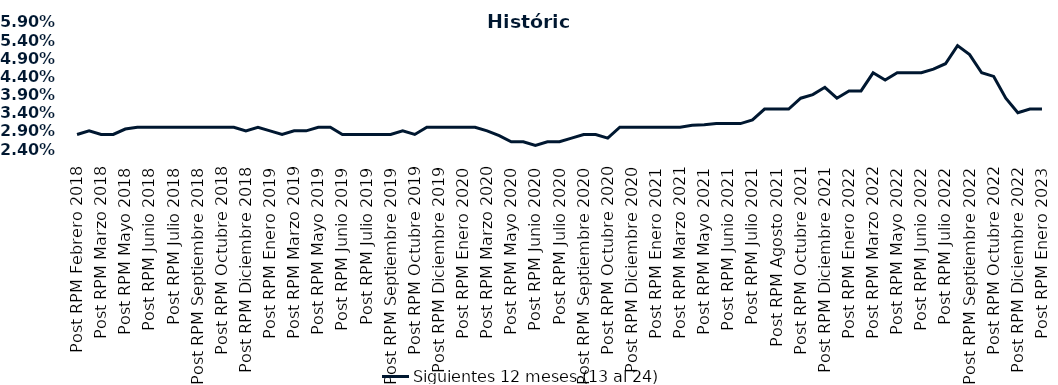
| Category | Siguientes 12 meses (13 al 24)  |
|---|---|
| Post RPM Febrero 2018 | 0.028 |
| Pre RPM Marzo 2018 | 0.029 |
| Post RPM Marzo 2018 | 0.028 |
| Pre RPM Mayo 2018 | 0.028 |
| Post RPM Mayo 2018 | 0.03 |
| Pre RPM Junio 2018 | 0.03 |
| Post RPM Junio 2018 | 0.03 |
| Pre RPM Julio 2018 | 0.03 |
| Post RPM Julio 2018 | 0.03 |
| Pre RPM Septiembre 2018 | 0.03 |
| Post RPM Septiembre 2018 | 0.03 |
| Pre RPM Octubre 2018 | 0.03 |
| Post RPM Octubre 2018 | 0.03 |
| Pre RPM Diciembre 2018 | 0.03 |
| Post RPM Diciembre 2018 | 0.029 |
| Pre RPM Enero 2019 | 0.03 |
| Post RPM Enero 2019 | 0.029 |
| Pre RPM Marzo 2019 | 0.028 |
| Post RPM Marzo 2019 | 0.029 |
| Pre RPM Mayo 2019 | 0.029 |
| Post RPM Mayo 2019 | 0.03 |
| Pre RPM Junio 2019 | 0.03 |
| Post RPM Junio 2019 | 0.028 |
| Pre RPM Julio 2019 | 0.028 |
| Post RPM Julio 2019 | 0.028 |
| Pre RPM Septiembre 2019 | 0.028 |
| Post RPM Septiembre 2019 | 0.028 |
| Pre RPM Octubre 2019 | 0.029 |
| Post RPM Octubre 2019 | 0.028 |
| Pre RPM Diciembre 2019 | 0.03 |
| Post RPM Diciembre 2019 | 0.03 |
| Pre RPM Enero 2020 | 0.03 |
| Post RPM Enero 2020 | 0.03 |
| Pre RPM Marzo 2020 | 0.03 |
| Post RPM Marzo 2020 | 0.029 |
| Pre RPM Mayo 2020 | 0.028 |
| Post RPM Mayo 2020 | 0.026 |
| Pre RPM Junio 2020 | 0.026 |
| Post RPM Junio 2020 | 0.025 |
| Pre RPM Julio 2020 | 0.026 |
| Post RPM Julio 2020 | 0.026 |
| Pre RPM Septiembre 2020 | 0.027 |
| Post RPM Septiembre 2020 | 0.028 |
| Pre RPM Octubre 2020 | 0.028 |
| Post RPM Octubre 2020 | 0.027 |
| Pre RPM Diciembre 2020 | 0.03 |
| Post RPM Diciembre 2020 | 0.03 |
| Pre RPM Enero 2021 | 0.03 |
| Post RPM Enero 2021 | 0.03 |
| Pre RPM Marzo 2021 | 0.03 |
| Post RPM Marzo 2021 | 0.03 |
| Pre RPM Mayo 2021 | 0.031 |
| Post RPM Mayo 2021 | 0.031 |
| Pre RPM Junio 2021 | 0.031 |
| Post RPM Junio 2021 | 0.031 |
| Pre RPM Julio 2021 | 0.031 |
| Post RPM Julio 2021 | 0.032 |
| Pre RPM Agosto 2021 | 0.035 |
| Post RPM Agosto 2021 | 0.035 |
| Pre RPM Octubre 2021 | 0.035 |
| Post RPM Octubre 2021 | 0.038 |
| Pre RPM Diciembre 2021 | 0.039 |
| Post RPM Diciembre 2021 | 0.041 |
| Pre RPM Enero 2022 | 0.038 |
| Post RPM Enero 2022 | 0.04 |
| Pre RPM Marzo 2022 | 0.04 |
| Post RPM Marzo 2022 | 0.045 |
| Pre RPM Mayo 2022 | 0.043 |
| Post RPM Mayo 2022 | 0.045 |
| Pre RPM Junio 2022 | 0.045 |
| Post RPM Junio 2022 | 0.045 |
| Pre RPM Julio 2022 | 0.046 |
| Post RPM Julio 2022 | 0.048 |
| Pre RPM Septiembre 2022 | 0.052 |
| Post RPM Septiembre 2022 | 0.05 |
| Pre RPM Octubre 2022 | 0.045 |
| Post RPM Octubre 2022 | 0.044 |
| Pre RPM Diciembre 2022 | 0.038 |
| Post RPM Diciembre 2022 | 0.034 |
| Pre RPM Enero 2023 | 0.035 |
| Post RPM Enero 2023 | 0.035 |